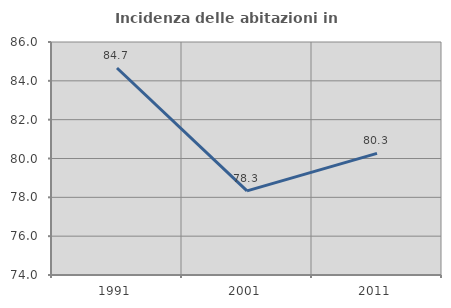
| Category | Incidenza delle abitazioni in proprietà  |
|---|---|
| 1991.0 | 84.662 |
| 2001.0 | 78.334 |
| 2011.0 | 80.264 |